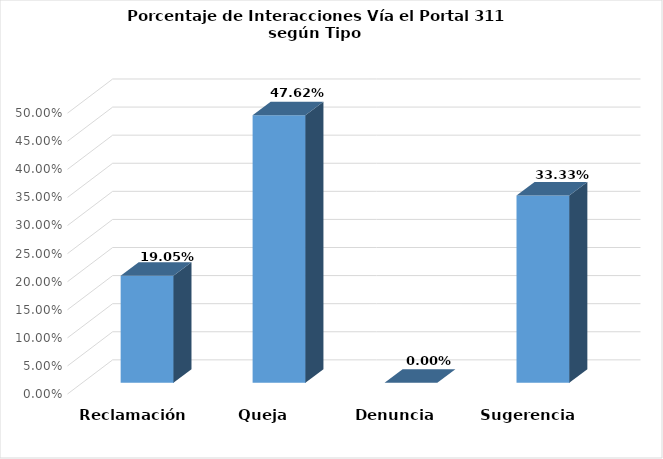
| Category | Series 0 |
|---|---|
| Reclamación | 0.19 |
| Queja | 0.476 |
| Denuncia | 0 |
| Sugerencia | 0.333 |